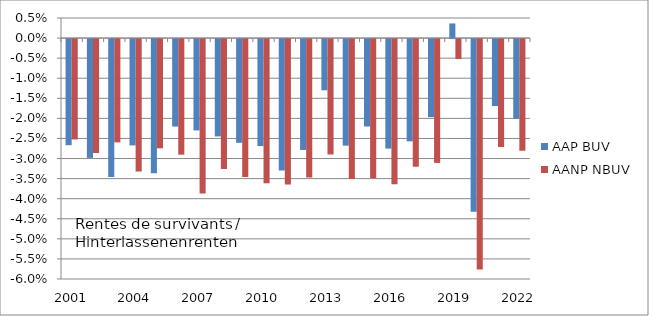
| Category | AAP | AANP |
|---|---|---|
|  2001 | -0.026 | -0.025 |
| 2002 | -0.03 | -0.028 |
| 2003 | -0.034 | -0.026 |
| 2004 | -0.026 | -0.033 |
| 2005 | -0.033 | -0.027 |
| 2006 | -0.022 | -0.029 |
| 2007 | -0.023 | -0.038 |
| 2008 | -0.024 | -0.032 |
| 2009 | -0.026 | -0.034 |
| 2010 | -0.027 | -0.036 |
| 2011 | -0.033 | -0.036 |
| 2012 | -0.028 | -0.034 |
| 2013 | -0.013 | -0.029 |
| 2014 | -0.027 | -0.035 |
| 2015 | -0.022 | -0.035 |
| 2016 | -0.027 | -0.036 |
| 2017 | -0.025 | -0.032 |
| 2018 | -0.019 | -0.031 |
| 2019 | 0.004 | -0.005 |
| 2020 | -0.043 | -0.057 |
| 2021 | -0.017 | -0.027 |
| 2022 | -0.02 | -0.028 |